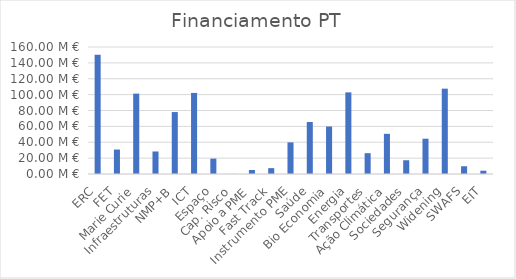
| Category | Financiamento PT |
|---|---|
| ERC | 150237208.17 |
| FET | 30815016.8 |
| Marie Curie | 101260312.71 |
| Infraestruturas | 28364177.93 |
| NMP+B | 78037815.53 |
| ICT | 102149573.4 |
| Espaço | 19385107.21 |
| Cap. Risco | 112375 |
| Apoio a PME | 5049113.92 |
| Fast Track | 7385573.16 |
| Instrumento PME | 39815517.66 |
| Saúde | 65479491.2 |
| Bio Economia | 59824963.79 |
| Energia | 102829945.73 |
| Transportes | 26220738.59 |
| Ação Climática | 50595164.06 |
| Sociedades | 17322036.23 |
| Segurança | 44471933.38 |
| Widening | 107501482.51 |
| SWAFS | 9762903.95 |
| EIT | 4167059.81 |